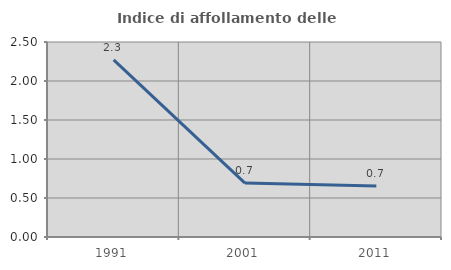
| Category | Indice di affollamento delle abitazioni  |
|---|---|
| 1991.0 | 2.27 |
| 2001.0 | 0.692 |
| 2011.0 | 0.652 |